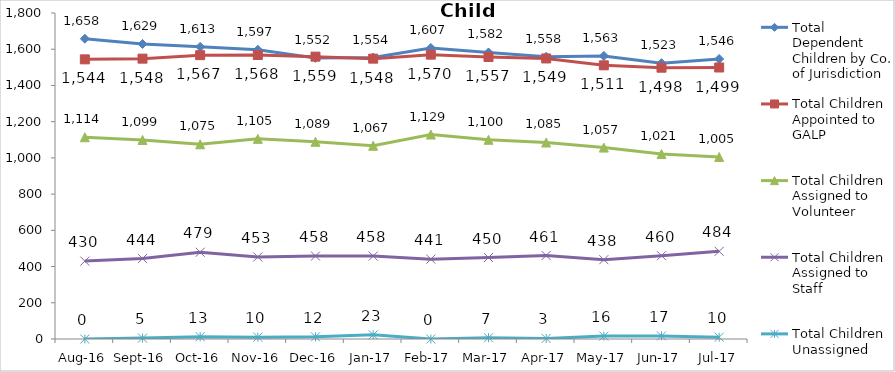
| Category | Total Dependent Children by Co. of Jurisdiction | Total Children Appointed to GALP | Total Children Assigned to Volunteer | Total Children Assigned to Staff | Total Children Unassigned |
|---|---|---|---|---|---|
| Aug-16 | 1658 | 1544 | 1114 | 430 | 0 |
| Sep-16 | 1629 | 1548 | 1099 | 444 | 5 |
| Oct-16 | 1613 | 1567 | 1075 | 479 | 13 |
| Nov-16 | 1597 | 1568 | 1105 | 453 | 10 |
| Dec-16 | 1552 | 1559 | 1089 | 458 | 12 |
| Jan-17 | 1554 | 1548 | 1067 | 458 | 23 |
| Feb-17 | 1607 | 1570 | 1129 | 441 | 0 |
| Mar-17 | 1582 | 1557 | 1100 | 450 | 7 |
| Apr-17 | 1558 | 1549 | 1085 | 461 | 3 |
| May-17 | 1563 | 1511 | 1057 | 438 | 16 |
| Jun-17 | 1523 | 1498 | 1021 | 460 | 17 |
| Jul-17 | 1546 | 1499 | 1005 | 484 | 10 |